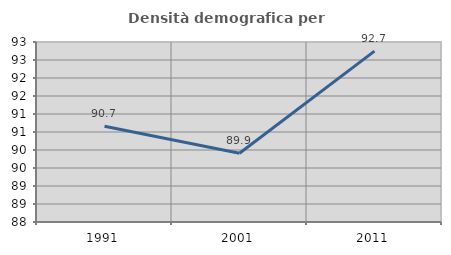
| Category | Densità demografica |
|---|---|
| 1991.0 | 90.66 |
| 2001.0 | 89.909 |
| 2011.0 | 92.746 |